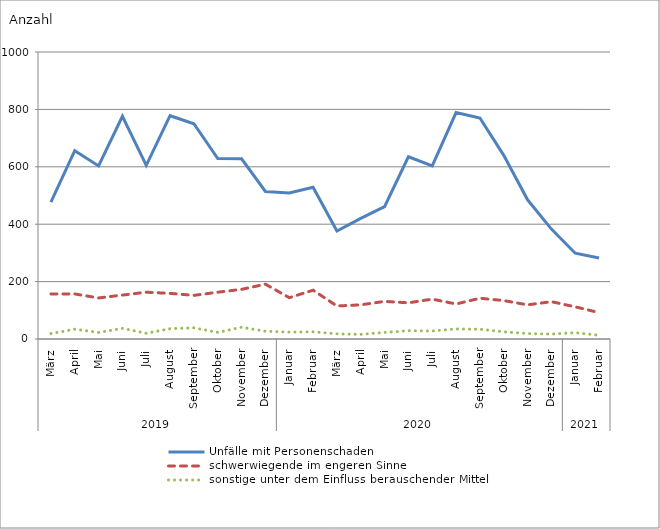
| Category | Unfälle mit Personenschaden | schwerwiegende im engeren Sinne | sonstige unter dem Einfluss berauschender Mittel |
|---|---|---|---|
| 0 | 477 | 157 | 19 |
| 1 | 656 | 157 | 34 |
| 2 | 603 | 143 | 23 |
| 3 | 776 | 153 | 37 |
| 4 | 605 | 163 | 20 |
| 5 | 778 | 159 | 36 |
| 6 | 750 | 152 | 39 |
| 7 | 629 | 163 | 23 |
| 8 | 628 | 173 | 41 |
| 9 | 514 | 191 | 27 |
| 10 | 509 | 144 | 24 |
| 11 | 529 | 170 | 25 |
| 12 | 376 | 115 | 18 |
| 13 | 420 | 119 | 16 |
| 14 | 461 | 131 | 23 |
| 15 | 635 | 126 | 29 |
| 16 | 603 | 139 | 28 |
| 17 | 789 | 122 | 35 |
| 18 | 770 | 142 | 34 |
| 19 | 640 | 134 | 25 |
| 20 | 485 | 119 | 19 |
| 21 | 383 | 130 | 17 |
| 22 | 299 | 112 | 22 |
| 23 | 282 | 92 | 13 |